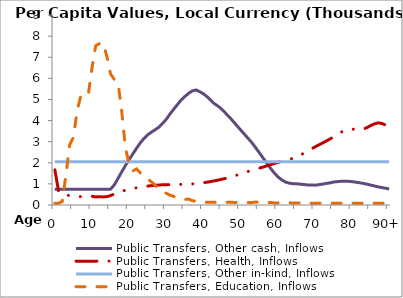
| Category | Public Transfers, Other cash, Inflows | Public Transfers, Health, Inflows | Public Transfers, Other in-kind, Inflows | Public Transfers, Education, Inflows |
|---|---|---|---|---|
| 0 | 743.783 | 1665.429 | 2045.042 | 82.82 |
|  | 743.783 | 651.907 | 2045.042 | 82.82 |
| 2 | 743.783 | 484.413 | 2045.042 | 169.55 |
| 3 | 743.783 | 448.382 | 2045.042 | 1451.78 |
| 4 | 743.783 | 460.45 | 2045.042 | 2853.479 |
| 5 | 743.783 | 430.557 | 2045.042 | 3201.729 |
| 6 | 743.783 | 403.457 | 2045.042 | 4467.509 |
| 7 | 743.783 | 396.205 | 2045.042 | 5178.689 |
| 8 | 743.783 | 399.977 | 2045.042 | 5218.774 |
| 9 | 743.783 | 399.689 | 2045.042 | 5212.609 |
| 10 | 743.783 | 410.735 | 2045.042 | 6496.289 |
| 11 | 743.783 | 383.086 | 2045.042 | 7542.959 |
| 12 | 743.784 | 390.136 | 2045.042 | 7645.975 |
| 13 | 743.783 | 383.369 | 2045.042 | 7668.149 |
| 14 | 744.395 | 397.841 | 2045.042 | 7043.002 |
| 15 | 752.143 | 447.754 | 2045.042 | 6207.394 |
| 16 | 949.584 | 517.268 | 2045.042 | 5947.691 |
| 17 | 1258.114 | 586.781 | 2045.042 | 5794.553 |
| 18 | 1566.644 | 650.007 | 2045.042 | 4459.236 |
| 19 | 1871.364 | 704.118 | 2045.042 | 2713.056 |
| 20 | 2159.646 | 747.856 | 2045.042 | 1924.752 |
| 21 | 2419.835 | 783.77 | 2045.042 | 1614.244 |
| 22 | 2689.908 | 816.086 | 2045.042 | 1708.489 |
| 23 | 2945.073 | 844.66 | 2045.042 | 1519.872 |
| 24 | 3151.704 | 870.732 | 2045.042 | 1409.421 |
| 25 | 3326.539 | 896.502 | 2045.042 | 1228.416 |
| 26 | 3449.398 | 918.224 | 2045.042 | 1094.399 |
| 27 | 3563.902 | 933.292 | 2045.042 | 944.497 |
| 28 | 3686.23 | 947.064 | 2045.042 | 740.935 |
| 29 | 3858.655 | 957.533 | 2045.042 | 616.814 |
| 30 | 4061.084 | 962.729 | 2045.042 | 556.174 |
| 31 | 4310.448 | 966.416 | 2045.042 | 465.704 |
| 32 | 4538.835 | 972.576 | 2045.042 | 408.325 |
| 33 | 4756.441 | 974.528 | 2045.042 | 348.98 |
| 34 | 4972.6 | 977.127 | 2045.042 | 307.095 |
| 35 | 5140.303 | 982.217 | 2045.042 | 259.48 |
| 36 | 5288.587 | 989.981 | 2045.042 | 282.884 |
| 37 | 5404.3 | 998.441 | 2045.042 | 205.51 |
| 38 | 5450.156 | 1013.134 | 2045.042 | 178.32 |
| 39 | 5367.519 | 1031.559 | 2045.042 | 173.98 |
| 40 | 5265.83 | 1054.568 | 2045.042 | 130.292 |
| 41 | 5129.094 | 1081.884 | 2045.042 | 127.424 |
| 42 | 4954.712 | 1112.114 | 2045.042 | 125.87 |
| 43 | 4788.926 | 1145.012 | 2045.042 | 125.908 |
| 44 | 4674.224 | 1182.56 | 2045.042 | 129.946 |
| 45 | 4529.192 | 1222.414 | 2045.042 | 126.61 |
| 46 | 4342.183 | 1263.352 | 2045.042 | 126.04 |
| 47 | 4160.758 | 1311.021 | 2045.042 | 124.957 |
| 48 | 3963.434 | 1361.446 | 2045.042 | 124.41 |
| 49 | 3761.146 | 1414.581 | 2045.042 | 121.32 |
| 50 | 3556.971 | 1471.7 | 2045.042 | 118.97 |
| 51 | 3360.516 | 1531.925 | 2045.042 | 119.236 |
| 52 | 3160.704 | 1588.334 | 2045.042 | 114.228 |
| 53 | 2962.202 | 1643.888 | 2045.042 | 117.71 |
| 54 | 2728.747 | 1695.365 | 2045.042 | 138.546 |
| 55 | 2487.313 | 1743.75 | 2045.042 | 134.216 |
| 56 | 2242.332 | 1793.711 | 2045.042 | 115.008 |
| 57 | 2003.26 | 1850.882 | 2045.042 | 108.37 |
| 58 | 1751.868 | 1906.467 | 2045.042 | 121.809 |
| 59 | 1533.549 | 1961.375 | 2045.042 | 100.32 |
| 60 | 1343.571 | 2016.702 | 2045.042 | 99.36 |
| 61 | 1199.55 | 2066.993 | 2045.042 | 104.4 |
| 62 | 1092.849 | 2107.363 | 2045.042 | 104.11 |
| 63 | 1039.166 | 2152.132 | 2045.042 | 101.83 |
| 64 | 1010.141 | 2210.087 | 2045.042 | 99.49 |
| 65 | 1003.056 | 2275.525 | 2045.042 | 96.69 |
| 66 | 990.382 | 2354.694 | 2045.042 | 93.72 |
| 67 | 970.006 | 2450.104 | 2045.042 | 90.78 |
| 68 | 951.778 | 2551.212 | 2045.042 | 88.15 |
| 69 | 946.516 | 2649.48 | 2045.042 | 85.42 |
| 70 | 939.791 | 2748.029 | 2045.042 | 82.82 |
| 71 | 959.552 | 2841.41 | 2045.042 | 82.82 |
| 72 | 987.909 | 2930.512 | 2045.042 | 82.82 |
| 73 | 1019.092 | 3023.197 | 2045.042 | 82.82 |
| 74 | 1044.987 | 3119.787 | 2045.042 | 82.82 |
| 75 | 1085.461 | 3222.049 | 2045.042 | 82.82 |
| 76 | 1106.085 | 3333.53 | 2045.042 | 82.82 |
| 77 | 1121.57 | 3445.825 | 2045.042 | 82.82 |
| 78 | 1127.568 | 3530.733 | 2045.042 | 82.82 |
| 79 | 1123.707 | 3578.235 | 2045.042 | 82.82 |
| 80 | 1104.486 | 3593.665 | 2045.042 | 82.82 |
| 81 | 1082.067 | 3584.573 | 2045.042 | 82.82 |
| 82 | 1055.391 | 3563.001 | 2045.042 | 82.82 |
| 83 | 1023.381 | 3591.624 | 2045.042 | 82.82 |
| 84 | 986.569 | 3663.094 | 2045.042 | 82.82 |
| 85 | 944.647 | 3759.305 | 2045.042 | 82.82 |
| 86 | 903.124 | 3841.701 | 2045.042 | 82.82 |
| 87 | 863.243 | 3889.482 | 2045.042 | 82.82 |
| 88 | 826.252 | 3864.477 | 2045.042 | 82.82 |
| 89 | 793.395 | 3791.885 | 2045.042 | 82.82 |
| 90+ | 760.537 | 3719.292 | 2045.042 | 82.82 |